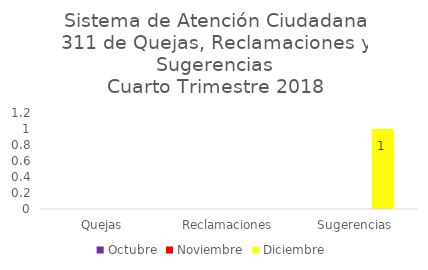
| Category | Octubre | Noviembre | Diciembre |
|---|---|---|---|
| Quejas | 0 | 0 | 0 |
| Reclamaciones | 0 | 0 | 0 |
| Sugerencias | 0 | 0 | 1 |